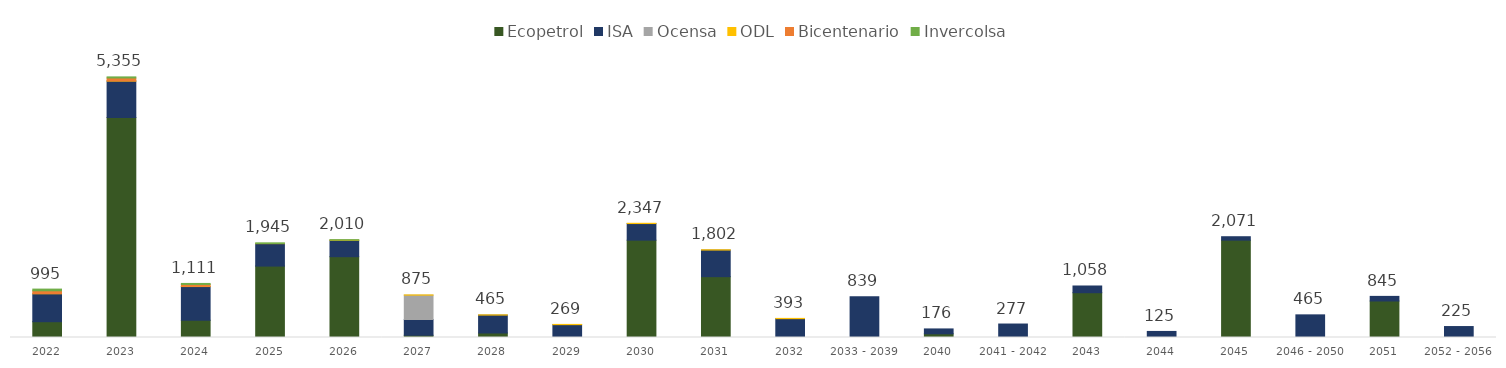
| Category | Ecopetrol | ISA | Ocensa | ODL | Bicentenario | Invercolsa |
|---|---|---|---|---|---|---|
| 2022 | 324.533 | 574.186 | 0 | 3.26 | 57.849 | 34.903 |
| 2023 | 4522.956 | 745.711 | 0 | 3.488 | 60.65 | 22.216 |
| 2024 | 353.823 | 693.032 | 0 | 3.733 | 39.593 | 20.545 |
| 2025 | 1467.229 | 461.255 | 0 | 3.995 | 0 | 12.644 |
| 2026 | 1660.47 | 336.834 | 0 | 4.275 | 0 | 8.377 |
| 2027 | 45.849 | 324.424 | 500 | 4.574 | 0 | 0 |
| 2028 | 92.712 | 367.633 | 0 | 4.895 | 0 | 0 |
| 2029 | 0 | 263.711 | 0 | 5.238 | 0 | 0 |
| 2030 | 2000 | 341.303 | 0 | 5.605 | 0 | 0 |
| 2031 | 1250 | 546.425 | 0 | 5.998 | 0 | 0 |
| 2032 | 0 | 386.86 | 0 | 5.867 | 0 | 0 |
| 2033 - 2039 | 0 | 839.46 | 0 | 0 | 0 | 0 |
| 2040 | 75.851 | 100.305 | 0 | 0 | 0 | 0 |
| 2041 - 2042 | 0 | 276.933 | 0 | 0 | 0 | 0 |
| 2043 | 920.155 | 138.238 | 0 | 0 | 0 | 0 |
| 2044 | 0 | 124.586 | 0 | 0 | 0 | 0 |
| 2045 | 2000 | 70.897 | 0 | 0 | 0 | 0 |
| 2046 - 2050 | 0 | 465.426 | 0 | 0 | 0 | 0 |
| 2051 | 750 | 94.883 | 0 | 0 | 0 | 0 |
| 2052 - 2056 | 0 | 225.207 | 0 | 0 | 0 | 0 |